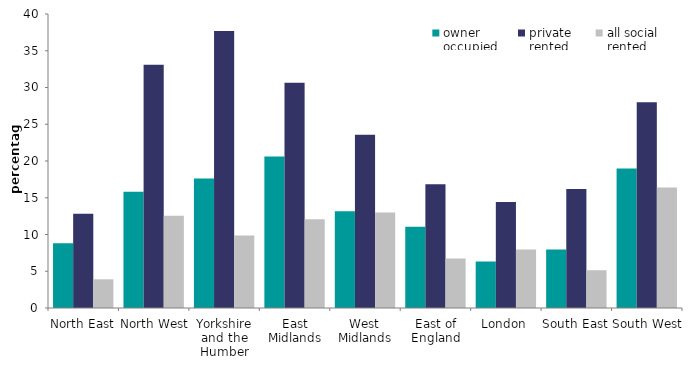
| Category | owner
occupied | private
rented | all social
rented |
|---|---|---|---|
| North East | 8.824 | 12.824 | 3.903 |
| North West | 15.832 | 33.107 | 12.561 |
| Yorkshire and the Humber | 17.623 | 37.694 | 9.87 |
| East Midlands | 20.612 | 30.657 | 12.085 |
| West Midlands | 13.163 | 23.565 | 12.994 |
| East of England | 11.07 | 16.834 | 6.732 |
| London | 6.339 | 14.423 | 7.967 |
| South East | 7.968 | 16.196 | 5.14 |
| South West | 18.987 | 28.003 | 16.395 |